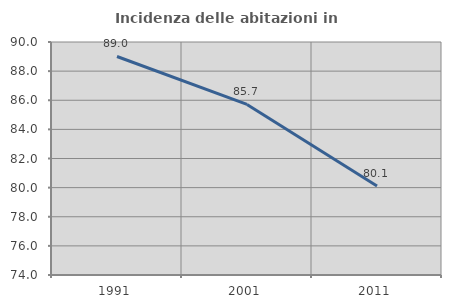
| Category | Incidenza delle abitazioni in proprietà  |
|---|---|
| 1991.0 | 89.005 |
| 2001.0 | 85.714 |
| 2011.0 | 80.117 |